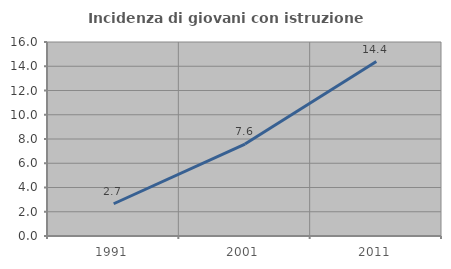
| Category | Incidenza di giovani con istruzione universitaria |
|---|---|
| 1991.0 | 2.66 |
| 2001.0 | 7.586 |
| 2011.0 | 14.384 |